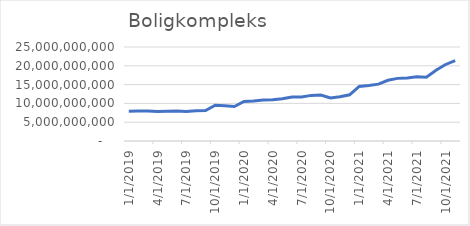
| Category | Boligkompleks |
|---|---|
| 1/1/19 | 7937998750 |
| 2/1/19 | 7961432083.333 |
| 3/1/19 | 7951093750 |
| 4/1/19 | 7851028750 |
| 5/1/19 | 7902962916.667 |
| 6/1/19 | 7947777500 |
| 7/1/19 | 7861281666.667 |
| 8/1/19 | 8060919166.667 |
| 9/1/19 | 8087900000 |
| 10/1/19 | 9529279166.667 |
| 11/1/19 | 9405804166.667 |
| 12/1/19 | 9177037500 |
| 1/1/20 | 10498687500 |
| 2/1/20 | 10609570833.333 |
| 3/1/20 | 10883500000 |
| 4/1/20 | 10979050000 |
| 5/1/20 | 11220071666.667 |
| 6/1/20 | 11683905000 |
| 7/1/20 | 11726380000 |
| 8/1/20 | 12132400833.333 |
| 9/1/20 | 12216205000 |
| 10/1/20 | 11439888333.333 |
| 11/1/20 | 11762217500 |
| 12/1/20 | 12287750833.333 |
| 1/1/21 | 14523950833.333 |
| 2/1/21 | 14754413333.333 |
| 3/1/21 | 15123963333.333 |
| 4/1/21 | 16150313333.333 |
| 5/1/21 | 16655470833.333 |
| 6/1/21 | 16734462500 |
| 7/1/21 | 17091229166.667 |
| 8/1/21 | 16967737500 |
| 9/1/21 | 18821383333.333 |
| 10/1/21 | 20349391666.667 |
| 11/1/21 | 21402004166.667 |